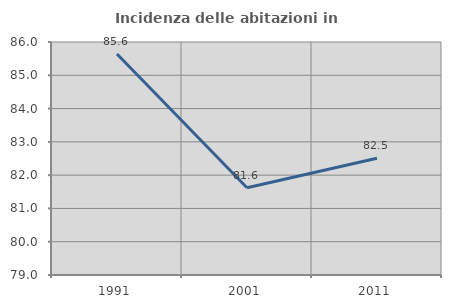
| Category | Incidenza delle abitazioni in proprietà  |
|---|---|
| 1991.0 | 85.638 |
| 2001.0 | 81.619 |
| 2011.0 | 82.509 |